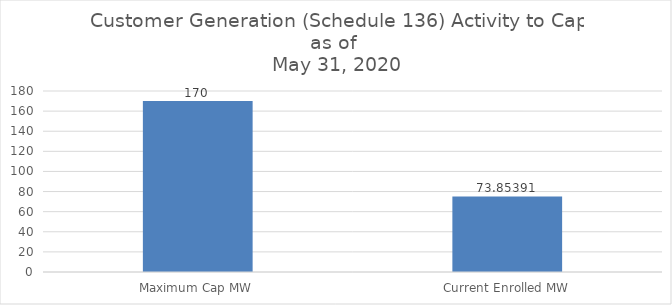
| Category | Series 0 |
|---|---|
| Maximum Cap MW | 170 |
| Current Enrolled MW | 75.17 |